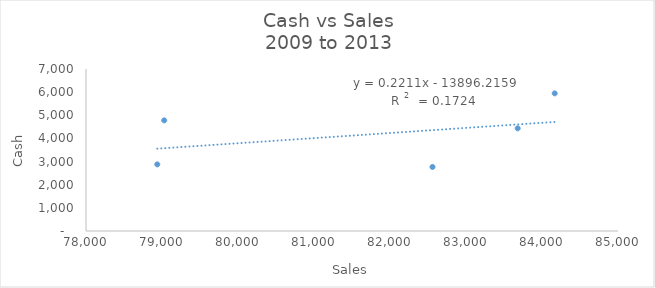
| Category | Cash |
|---|---|
| 84167.0 | 5947 |
| 83680.0 | 4436 |
| 82559.0 | 2768 |
| 78938.0 | 2879 |
| 79029.0 | 4781 |